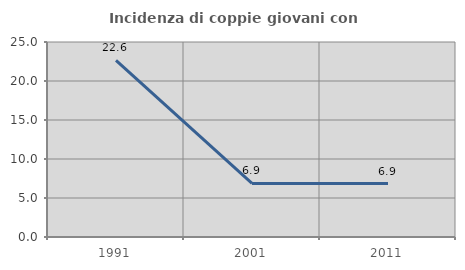
| Category | Incidenza di coppie giovani con figli |
|---|---|
| 1991.0 | 22.65 |
| 2001.0 | 6.87 |
| 2011.0 | 6.854 |